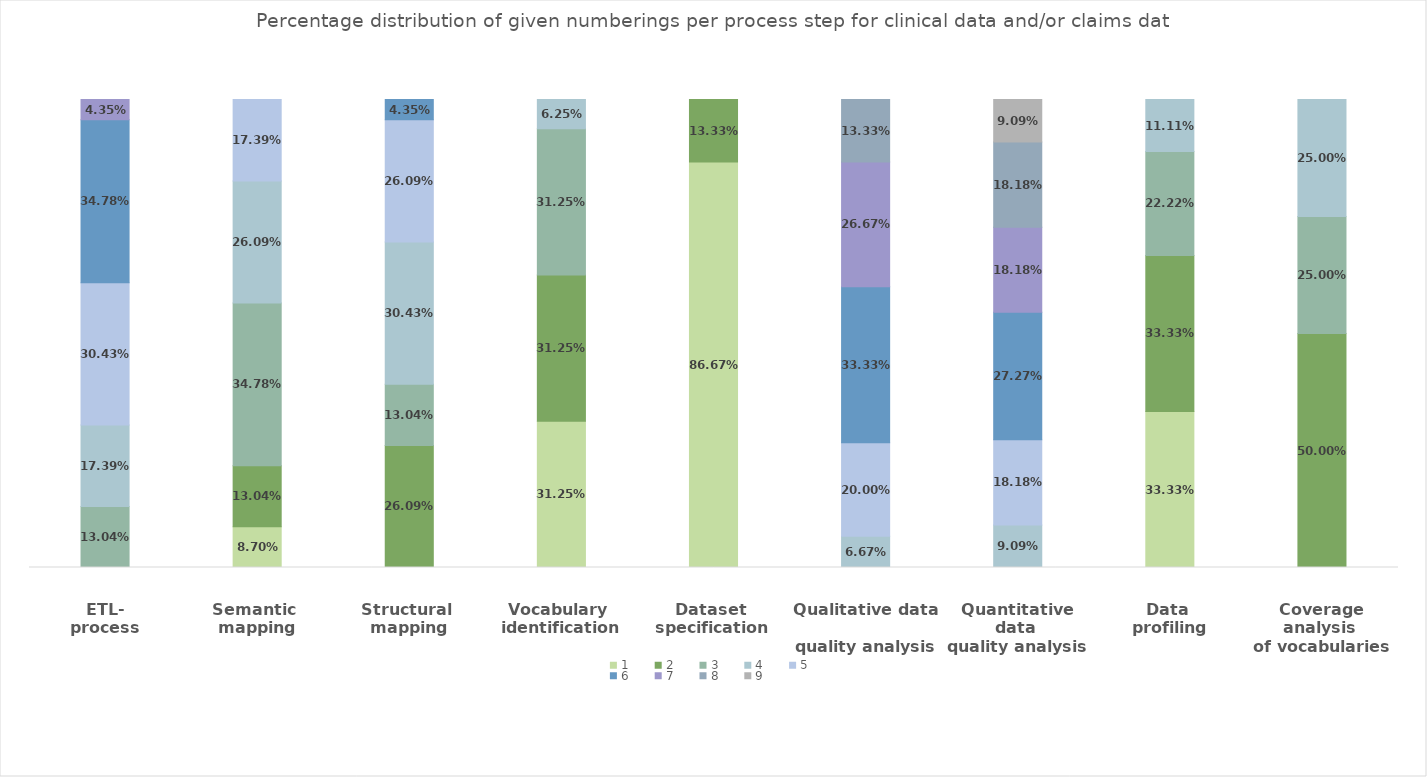
| Category | 1 | 2 | 3 | 4 | 5 | 6 | 7 | 8 | 9 |
|---|---|---|---|---|---|---|---|---|---|
| ETL-
process | 0 | 0 | 0.13 | 0.174 | 0.304 | 0.348 | 0.043 | 0 | 0 |
| Semantic 
mapping | 0.087 | 0.13 | 0.348 | 0.261 | 0.174 | 0 | 0 | 0 | 0 |
| Structural 
mapping | 0 | 0.261 | 0.13 | 0.304 | 0.261 | 0.043 | 0 | 0 | 0 |
| Vocabulary 
identification | 0.312 | 0.312 | 0.312 | 0.062 | 0 | 0 | 0 | 0 | 0 |
| Dataset 
specification | 0.867 | 0.133 | 0 | 0 | 0 | 0 | 0 | 0 | 0 |
| Qualitative data 
quality analysis | 0 | 0 | 0 | 0.067 | 0.2 | 0.333 | 0.267 | 0.133 | 0 |
| Quantitative data 
quality analysis | 0 | 0 | 0 | 0.091 | 0.182 | 0.273 | 0.182 | 0.182 | 0.091 |
| Data 
profiling | 0.333 | 0.333 | 0.222 | 0.111 | 0 | 0 | 0 | 0 | 0 |
| Coverage analysis 
of vocabularies | 0 | 0.5 | 0.25 | 0.25 | 0 | 0 | 0 | 0 | 0 |